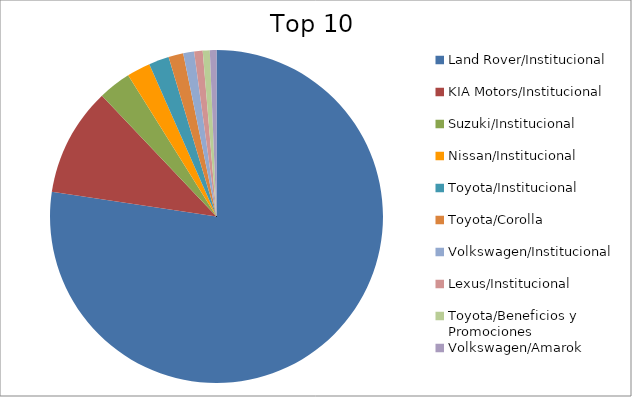
| Category | Series 0 |
|---|---|
| Land Rover/Institucional | 74.78 |
| KIA Motors/Institucional | 10.2 |
| Suzuki/Institucional | 3.07 |
| Nissan/Institucional | 2.21 |
| Toyota/Institucional | 1.9 |
| Toyota/Corolla | 1.39 |
| Volkswagen/Institucional | 1.02 |
| Lexus/Institucional | 0.8 |
| Toyota/Beneficios y Promociones | 0.66 |
| Volkswagen/Amarok | 0.62 |